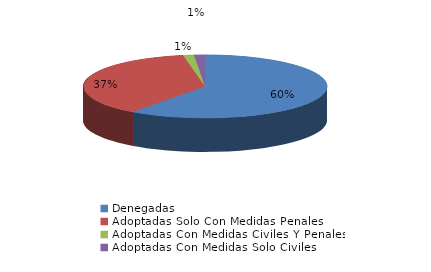
| Category | Series 0 |
|---|---|
| Denegadas | 42 |
| Adoptadas Solo Con Medidas Penales | 26 |
| Adoptadas Con Medidas Civiles Y Penales | 1 |
| Adoptadas Con Medidas Solo Civiles | 1 |